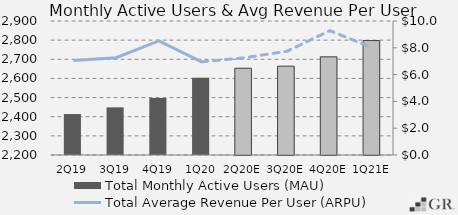
| Category | Total Monthly Active Users (MAU)  |
|---|---|
|  2Q19  | 2414 |
|  3Q19  | 2449 |
|  4Q19  | 2497.8 |
|  1Q20  | 2603 |
|  2Q20E  | 2653.24 |
|  3Q20E  | 2663.95 |
|  4Q20E  | 2712.769 |
|  1Q21E  | 2797.79 |